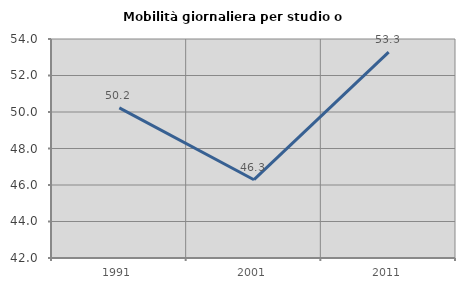
| Category | Mobilità giornaliera per studio o lavoro |
|---|---|
| 1991.0 | 50.222 |
| 2001.0 | 46.29 |
| 2011.0 | 53.282 |